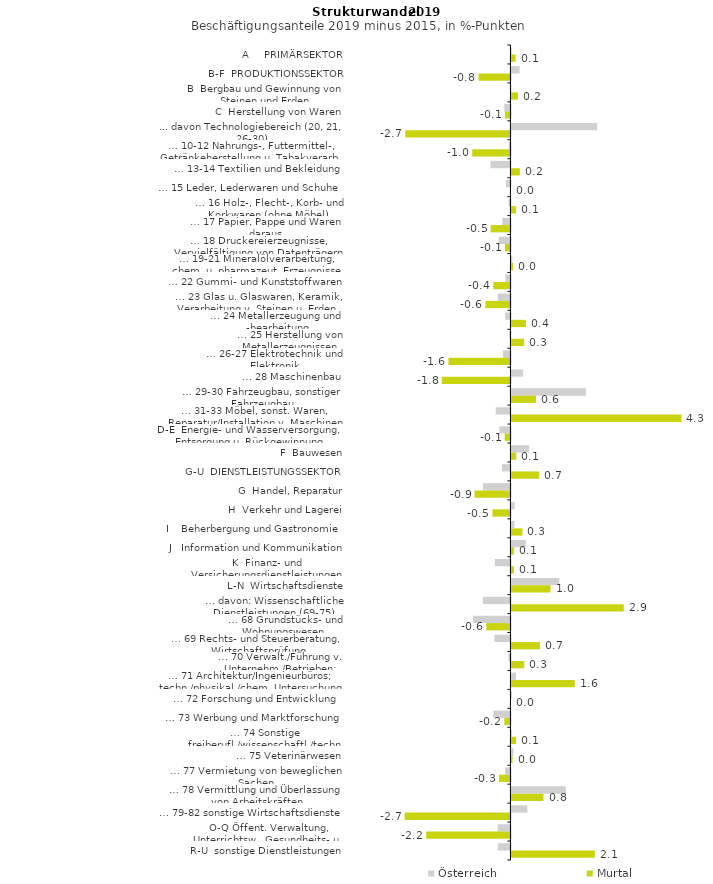
| Category | Österreich | Murtal |
|---|---|---|
| A     PRIMÄRSEKTOR | 0.009 | 0.106 |
| B-F  PRODUKTIONSSEKTOR | 0.208 | -0.818 |
| B  Bergbau und Gewinnung von Steinen und Erden | -0.008 | 0.167 |
| C  Herstellung von Waren | -0.159 | -0.143 |
| ... davon Technologiebereich (20, 21, 26-30) | 2.191 | -2.689 |
| … 10-12 Nahrungs-, Futtermittel-, Getränkeherstellung u. Tabakverarb. | -0.044 | -0.977 |
| … 13-14 Textilien und Bekleidung | -0.51 | 0.215 |
| … 15 Leder, Lederwaren und Schuhe | -0.114 | 0 |
| … 16 Holz-, Flecht-, Korb- und Korkwaren (ohne Möbel)  | -0.049 | 0.119 |
| … 17 Papier, Pappe und Waren daraus  | -0.209 | -0.507 |
| … 18 Druckereierzeugnisse, Vervielfältigung von Datenträgern | -0.302 | -0.141 |
| … 19-21 Mineralölverarbeitung, chem. u. pharmazeut. Erzeugnisse | 0.022 | 0.041 |
| … 22 Gummi- und Kunststoffwaren | -0.128 | -0.439 |
| … 23 Glas u. Glaswaren, Keramik, Verarbeitung v. Steinen u. Erden  | -0.322 | -0.638 |
| … 24 Metallerzeugung und -bearbeitung | -0.136 | 0.373 |
| … 25 Herstellung von Metallerzeugnissen  | -0.032 | 0.324 |
| … 26-27 Elektrotechnik und Elektronik | -0.193 | -1.585 |
| … 28 Maschinenbau | 0.297 | -1.758 |
| … 29-30 Fahrzeugbau, sonstiger Fahrzeugbau | 1.906 | 0.627 |
| … 31-33 Möbel, sonst. Waren, Reparatur/Installation v. Maschinen | -0.377 | 4.347 |
| D-E  Energie- und Wasserversorgung, Entsorgung u. Rückgewinnung | -0.284 | -0.148 |
| F  Bauwesen | 0.45 | 0.124 |
| G-U  DIENSTLEISTUNGSSEKTOR | -0.217 | 0.712 |
| G  Handel, Reparatur | -0.703 | -0.917 |
| H  Verkehr und Lagerei | 0.083 | -0.462 |
| I    Beherbergung und Gastronomie | 0.078 | 0.282 |
| J   Information und Kommunikation | 0.366 | 0.062 |
| K  Finanz- und Versicherungsdienstleistungen | -0.397 | 0.063 |
| L-N  Wirtschaftsdienste | 1.224 | 1 |
| … davon: Wissenschaftliche Dienstleistungen (69-75) | -0.706 | 2.873 |
| … 68 Grundstücks- und Wohnungswesen  | -0.954 | -0.616 |
| … 69 Rechts- und Steuerberatung, Wirtschaftsprüfung | -0.408 | 0.732 |
| … 70 Verwalt./Führung v. Unternehm./Betrieben; Unternehmensberat. | -0.052 | 0.327 |
| … 71 Architektur/Ingenieurbüros; techn./physikal./chem. Untersuchung | 0.116 | 1.619 |
| … 72 Forschung und Entwicklung  | 0.013 | 0 |
| … 73 Werbung und Marktforschung | -0.44 | -0.157 |
| … 74 Sonstige freiberufl./wissenschaftl./techn. Tätigkeiten | 0.011 | 0.118 |
| … 75 Veterinärwesen | 0.053 | 0.028 |
| … 77 Vermietung von beweglichen Sachen  | -0.137 | -0.291 |
| … 78 Vermittlung und Überlassung von Arbeitskräften | 1.388 | 0.82 |
| … 79-82 sonstige Wirtschaftsdienste | 0.408 | -2.705 |
| O-Q Öffent. Verwaltung, Unterrichtsw., Gesundheits- u. Sozialwesen | -0.326 | -2.154 |
| R-U  sonstige Dienstleistungen | -0.326 | 2.133 |